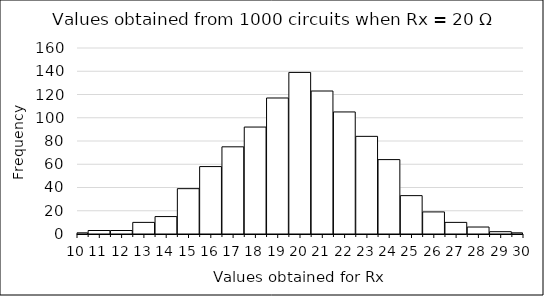
| Category | Series 0 |
|---|---|
| 10.0 | 1 |
| 11.0 | 3 |
| 12.0 | 3 |
| 13.0 | 10 |
| 14.0 | 15 |
| 15.0 | 39 |
| 16.0 | 58 |
| 17.0 | 75 |
| 18.0 | 92 |
| 19.0 | 117 |
| 20.0 | 139 |
| 21.0 | 123 |
| 22.0 | 105 |
| 23.0 | 84 |
| 24.0 | 64 |
| 25.0 | 33 |
| 26.0 | 19 |
| 27.0 | 10 |
| 28.0 | 6 |
| 29.0 | 2 |
| 30.0 | 1 |